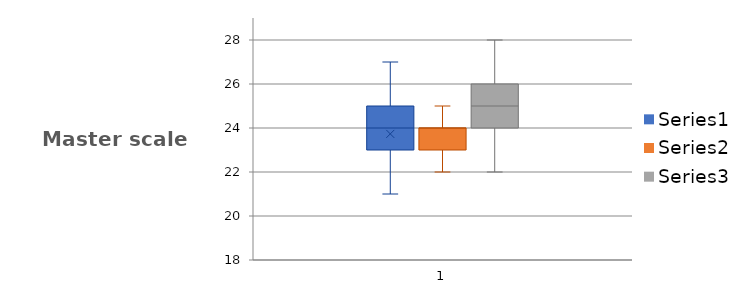
| Category | Series 0 |
|---|---|
| Equal recruitment       | 0.604 |
| Equal retention      | 0.969 |
| Equal ascertainment       | 0.571 |
| Equal implementation     | 0.646 |
| Equal prognosis | 0.375 |
| Sufficient analysis       | 0.899 |
| Temporal precedence | 1 |